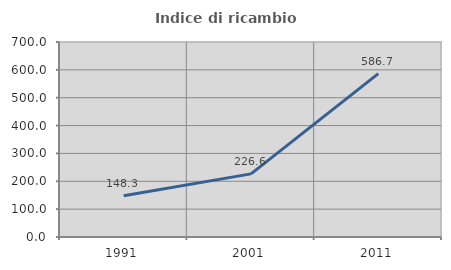
| Category | Indice di ricambio occupazionale  |
|---|---|
| 1991.0 | 148.315 |
| 2001.0 | 226.562 |
| 2011.0 | 586.667 |